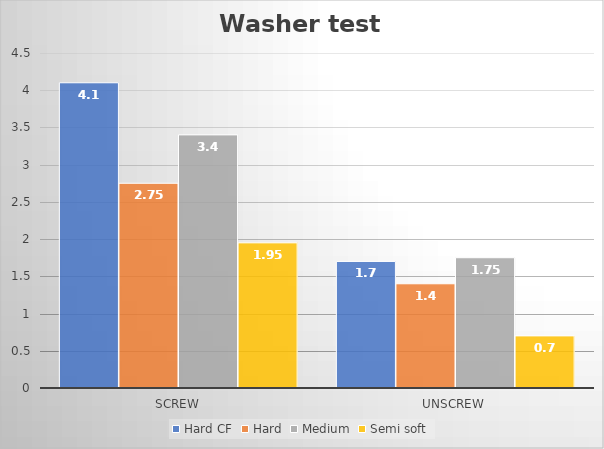
| Category | Hard CF | Hard | Medium | Semi soft |
|---|---|---|---|---|
| Screw | 4.1 | 2.75 | 3.4 | 1.95 |
| Unscrew | 1.7 | 1.4 | 1.75 | 0.7 |